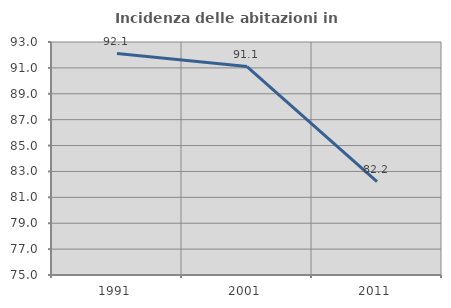
| Category | Incidenza delle abitazioni in proprietà  |
|---|---|
| 1991.0 | 92.104 |
| 2001.0 | 91.103 |
| 2011.0 | 82.205 |